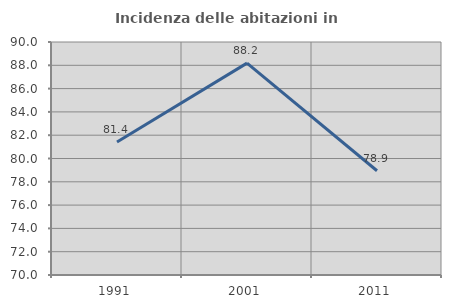
| Category | Incidenza delle abitazioni in proprietà  |
|---|---|
| 1991.0 | 81.413 |
| 2001.0 | 88.189 |
| 2011.0 | 78.947 |